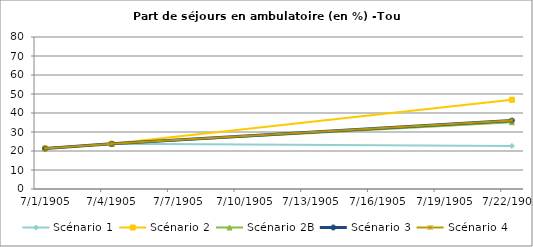
| Category | Scénario 1 | Scénario 2 | Scénario 2B | Scénario 3 | Scénario 4 |
|---|---|---|---|---|---|
| 2009.0 | 21.341 | 21.341 | 21.341 | 21.341 | 21.341 |
| 2012.0 | 23.779 | 23.779 | 23.779 | 23.779 | 23.779 |
| 2030.0 | 22.676 | 46.991 | 35.159 | 36.032 | 36.032 |